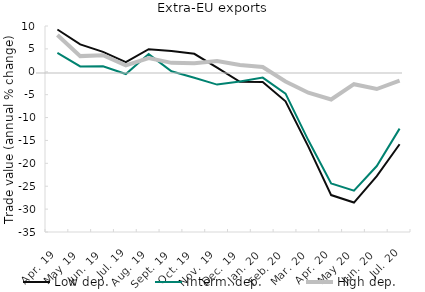
| Category | Low dep. | Interm. dep. | High dep. |
|---|---|---|---|
| Apr. 19 | 9.235 | 4.129 | 8.046 |
| May 19 | 5.995 | 1.165 | 3.424 |
| Jun. 19 | 4.34 | 1.211 | 3.618 |
| Jul. 19 | 2.099 | -0.489 | 1.416 |
| Aug. 19 | 4.927 | 3.858 | 3.007 |
| Sept. 19 | 4.514 | 0.12 | 1.95 |
| Oct. 19 | 3.928 | -1.307 | 1.872 |
| Nov. 19 | 0.916 | -2.798 | 2.345 |
| Dec. 19 | -2.197 | -2.119 | 1.485 |
| Jan. 20 | -2.227 | -1.274 | 1.032 |
| Feb. 20 | -6.441 | -4.759 | -2.111 |
| Mar. 20 | -16.349 | -14.976 | -4.571 |
| Apr. 20 | -26.932 | -24.404 | -6.056 |
| May 20 | -28.571 | -25.965 | -2.71 |
| Jun. 20 | -22.787 | -20.592 | -3.763 |
| Jul. 20 | -15.834 | -12.42 | -1.936 |